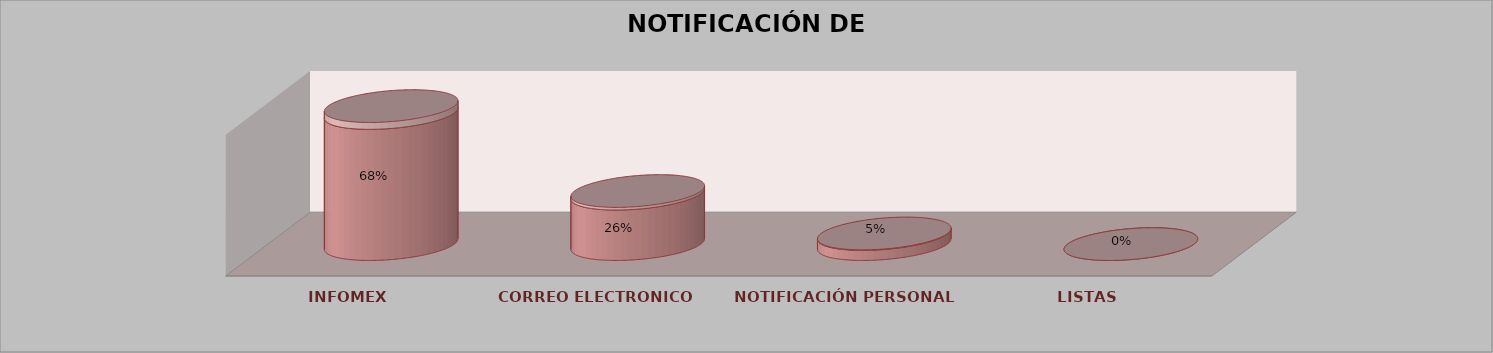
| Category | Series 0 | Series 1 | Series 2 | Series 3 | Series 4 |
|---|---|---|---|---|---|
| INFOMEX |  |  |  | 13 | 0.684 |
| CORREO ELECTRONICO |  |  |  | 5 | 0.263 |
| NOTIFICACIÓN PERSONAL |  |  |  | 1 | 0.053 |
| LISTAS |  |  |  | 0 | 0 |